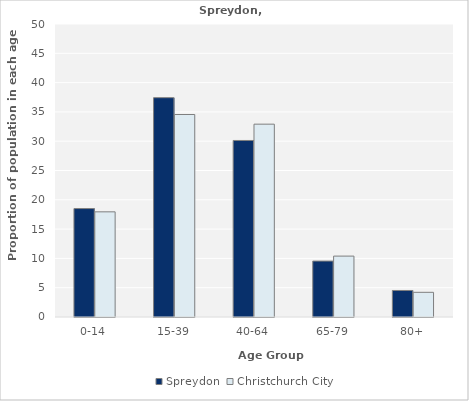
| Category | Spreydon | Christchurch City |
|---|---|---|
| 0-14 | 18.506 | 17.945 |
| 15-39 | 37.427 | 34.556 |
| 40-64 | 30.124 | 32.907 |
| 65-79 | 9.544 | 10.392 |
| 80+ | 4.523 | 4.211 |